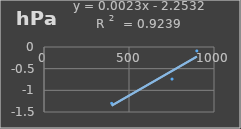
| Category | Presión Atmosférica |
|---|---|
| 397.9 | -1.3 |
| 753.1 | -0.74 |
| 899.0 | -0.09 |